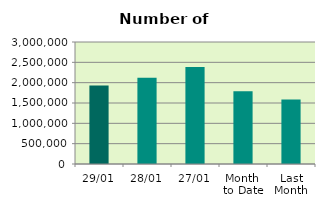
| Category | Series 0 |
|---|---|
| 29/01 | 1931846 |
| 28/01 | 2118980 |
| 27/01 | 2387568 |
| Month 
to Date | 1787159.6 |
| Last
Month | 1583843.3 |